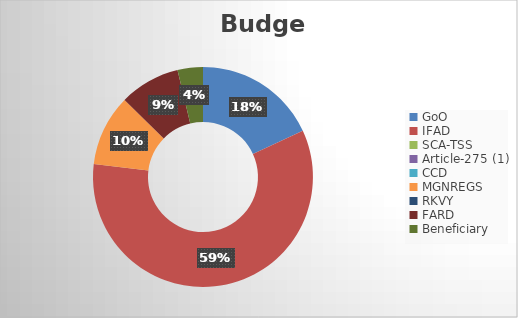
| Category |  Budget |
|---|---|
| GoO | 207729167 |
| IFAD | 674757228 |
| SCA-TSS | 0 |
| Article-275 (1) | 0 |
| CCD | 0 |
| MGNREGS | 120401800 |
| RKVY | 0 |
| FARD | 102320000 |
| Beneficiary | 42756140 |